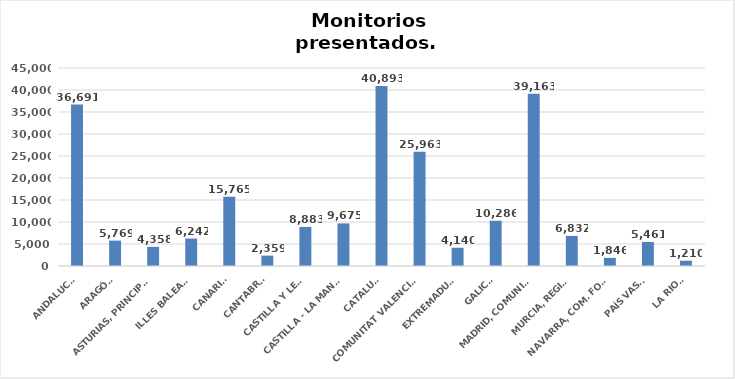
| Category | Series 0 |
|---|---|
| ANDALUCÍA | 36691 |
| ARAGÓN | 5769 |
| ASTURIAS, PRINCIPADO | 4358 |
| ILLES BALEARS | 6242 |
| CANARIAS | 15765 |
| CANTABRIA | 2359 |
| CASTILLA Y LEÓN | 8883 |
| CASTILLA - LA MANCHA | 9675 |
| CATALUÑA | 40893 |
| COMUNITAT VALENCIANA | 25963 |
| EXTREMADURA | 4140 |
| GALICIA | 10286 |
| MADRID, COMUNIDAD | 39163 |
| MURCIA, REGIÓN | 6832 |
| NAVARRA, COM. FORAL | 1846 |
| PAÍS VASCO | 5461 |
| LA RIOJA | 1210 |